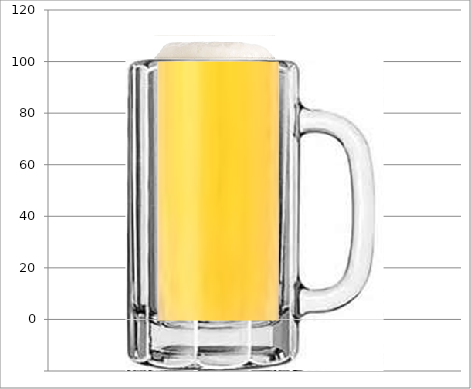
| Category | Lower Mug | Upper Mug | Beer Foam |
|---|---|---|---|
| 0 | -20 | 101 | 9 |